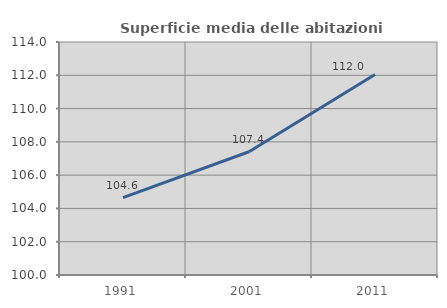
| Category | Superficie media delle abitazioni occupate |
|---|---|
| 1991.0 | 104.644 |
| 2001.0 | 107.404 |
| 2011.0 | 112.047 |